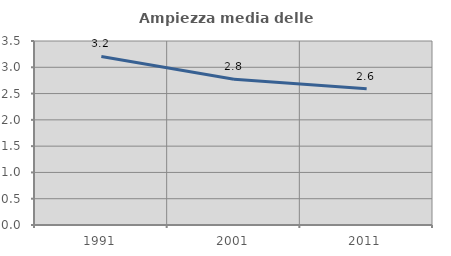
| Category | Ampiezza media delle famiglie |
|---|---|
| 1991.0 | 3.207 |
| 2001.0 | 2.771 |
| 2011.0 | 2.59 |